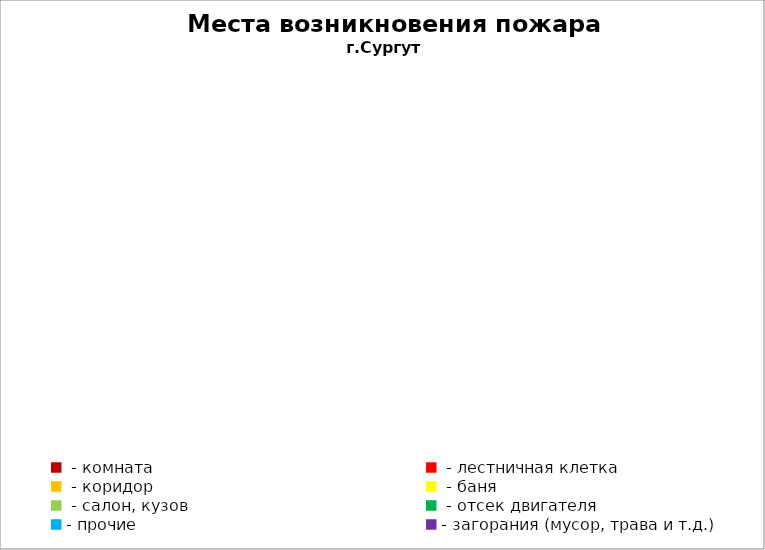
| Category | Места возникновения пожара |
|---|---|
|  - комната | 42 |
|  - лестничная клетка | 11 |
|  - коридор | 6 |
|  - баня | 15 |
|  - салон, кузов | 6 |
|  - отсек двигателя | 12 |
| - прочие | 63 |
| - загорания (мусор, трава и т.д.)  | 117 |